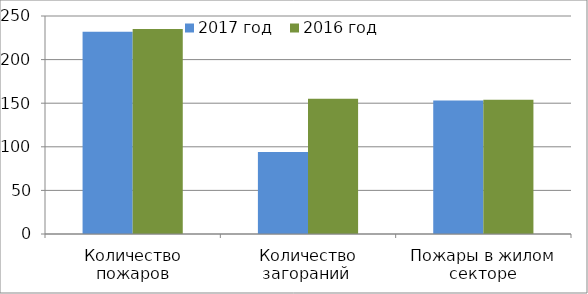
| Category | 2017 год | 2016 год |
|---|---|---|
| Количество пожаров | 232 | 235 |
| Количество загораний  | 94 | 155 |
| Пожары в жилом секторе | 153 | 154 |